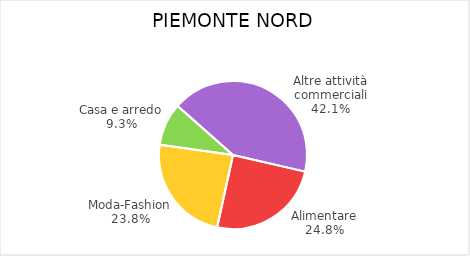
| Category | Piemonte Nord |
|---|---|
| Alimentare | 3199 |
| Moda-Fashion | 3067 |
| Casa e arredo | 1199 |
| Altre attività commerciali | 5423 |